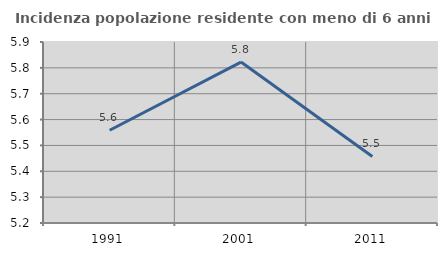
| Category | Incidenza popolazione residente con meno di 6 anni |
|---|---|
| 1991.0 | 5.559 |
| 2001.0 | 5.822 |
| 2011.0 | 5.458 |